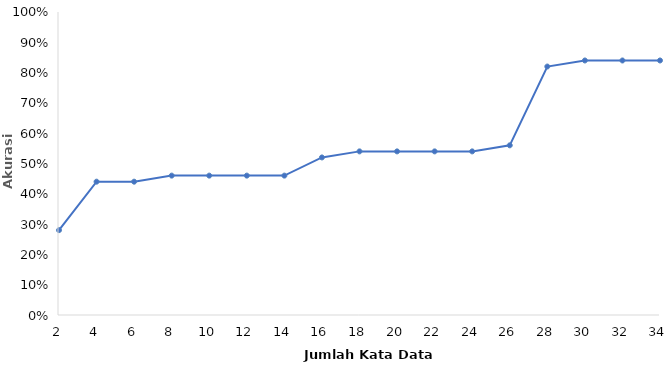
| Category | Series 0 |
|---|---|
| 2 | 0.28 |
| 4 | 0.44 |
| 6 | 0.44 |
| 8 | 0.46 |
| 10 | 0.46 |
| 12 | 0.46 |
| 14 | 0.46 |
| 16 | 0.52 |
| 18 | 0.54 |
| 20 | 0.54 |
| 22 | 0.54 |
| 24 | 0.54 |
| 26 | 0.56 |
| 28 | 0.82 |
| 30 | 0.84 |
| 32 | 0.84 |
| 34 | 0.84 |